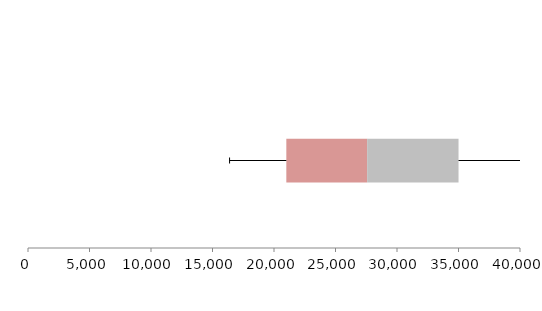
| Category | Series 1 | Series 2 | Series 3 |
|---|---|---|---|
| 0 | 21001.988 | 6570.974 | 7429.417 |